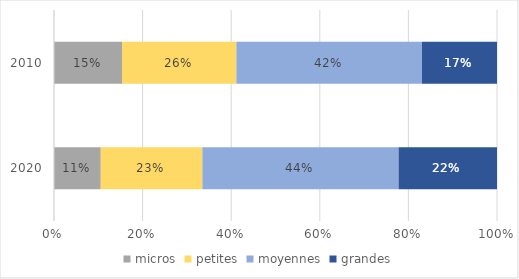
| Category | micros | petites | moyennes | grandes |
|---|---|---|---|---|
| 2020.0 | 0.106 | 0.229 | 0.443 | 0.222 |
| 2010.0 | 0.154 | 0.258 | 0.419 | 0.169 |